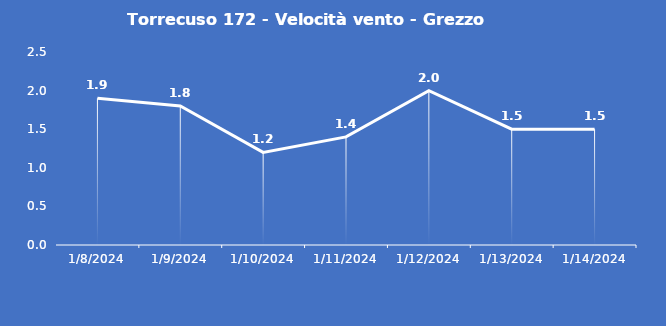
| Category | Torrecuso 172 - Velocità vento - Grezzo (m/s) |
|---|---|
| 1/8/24 | 1.9 |
| 1/9/24 | 1.8 |
| 1/10/24 | 1.2 |
| 1/11/24 | 1.4 |
| 1/12/24 | 2 |
| 1/13/24 | 1.5 |
| 1/14/24 | 1.5 |